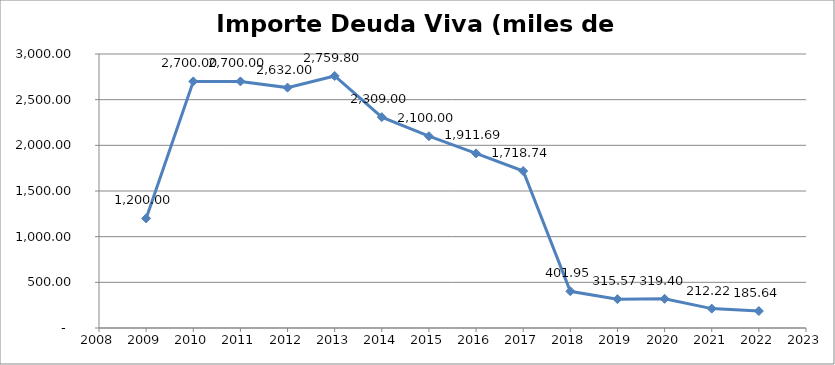
| Category | Importe deuda viva (miles de €) |
|---|---|
| 2009.0 | 1200 |
| 2010.0 | 2700 |
| 2011.0 | 2700 |
| 2012.0 | 2632 |
| 2013.0 | 2759.802 |
| 2014.0 | 2308.997 |
| 2015.0 | 2100 |
| 2016.0 | 1911.693 |
| 2017.0 | 1718.74 |
| 2018.0 | 401.949 |
| 2019.0 | 315.569 |
| 2020.0 | 319.397 |
| 2021.0 | 212.218 |
| 2022.0 | 185.638 |